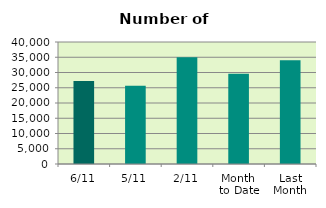
| Category | Series 0 |
|---|---|
| 6/11 | 27200 |
| 5/11 | 25666 |
| 2/11 | 34960 |
| Month 
to Date | 29579 |
| Last
Month | 34034.348 |